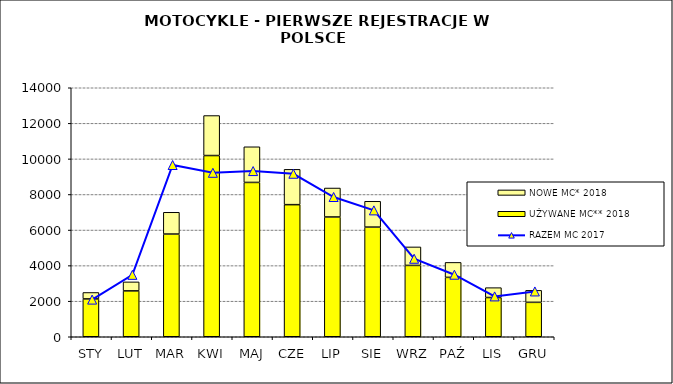
| Category | UŻYWANE MC** 2018 | NOWE MC* 2018 |
|---|---|---|
| STY | 2127 | 362 |
| LUT | 2579 | 506 |
| MAR | 5774 | 1225 |
| KWI | 10189 | 2249 |
| MAJ | 8677 | 2004 |
| CZE | 7427 | 1986 |
| LIP | 6734 | 1629 |
| SIE | 6165 | 1452 |
| WRZ | 4011 | 1040 |
| PAŹ | 3339 | 841 |
| LIS | 2206 | 555 |
| GRU | 1935 | 675 |